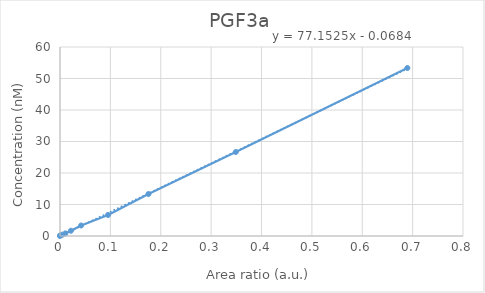
| Category | PGF3a |
|---|---|
| 0.0 | 0 |
| 0.000320446639065333 | 0.208 |
| 0.0046586924200946 | 0.417 |
| 0.0106543107416676 | 0.833 |
| 0.0217619102763265 | 1.667 |
| 0.0418592936998722 | 3.333 |
| 0.0953944474300251 | 6.667 |
| 0.1755929790296 | 13.333 |
| 0.348951340326052 | 26.667 |
| 0.689514744554376 | 53.333 |